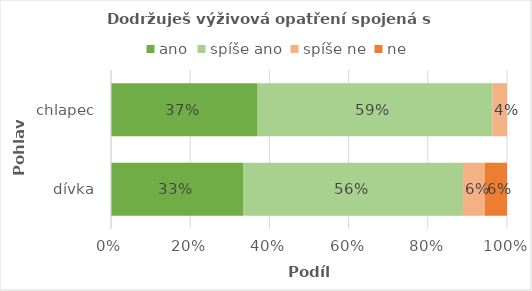
| Category | ano | spíše ano | spíše ne | ne |
|---|---|---|---|---|
| dívka | 0.333 | 0.556 | 0.056 | 0.056 |
| chlapec | 0.37 | 0.593 | 0.037 | 0 |